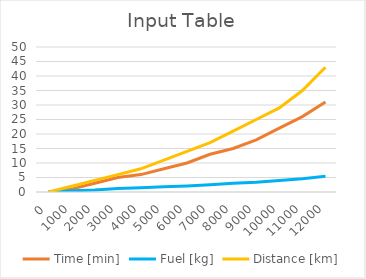
| Category | Time [min] | Fuel [kg] | Distance [km] |
|---|---|---|---|
| 0.0 | 0 | 0 | 0 |
| 1000.0 | 1 | 0.4 | 2 |
| 2000.0 | 3 | 0.7 | 4 |
| 3000.0 | 5 | 1.2 | 6 |
| 4000.0 | 6 | 1.5 | 8 |
| 5000.0 | 8 | 1.8 | 11 |
| 6000.0 | 10 | 2.1 | 14 |
| 7000.0 | 13 | 2.5 | 17 |
| 8000.0 | 15 | 3 | 21 |
| 9000.0 | 18 | 3.4 | 25 |
| 10000.0 | 22 | 4 | 29 |
| 11000.0 | 26 | 4.6 | 35 |
| 12000.0 | 31 | 5.4 | 43 |